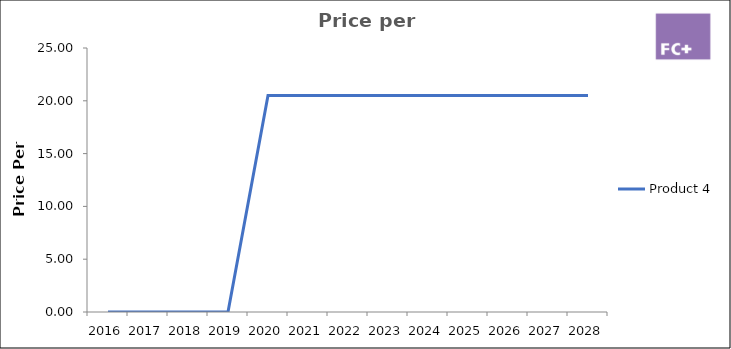
| Category | Product 4 |
|---|---|
| 2016.0 | 0 |
| 2017.0 | 0 |
| 2018.0 | 0 |
| 2019.0 | 0 |
| 2020.0 | 20.5 |
| 2021.0 | 20.5 |
| 2022.0 | 20.5 |
| 2023.0 | 20.5 |
| 2024.0 | 20.5 |
| 2025.0 | 20.5 |
| 2026.0 | 20.5 |
| 2027.0 | 20.5 |
| 2028.0 | 20.5 |